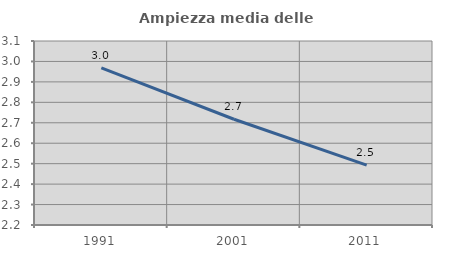
| Category | Ampiezza media delle famiglie |
|---|---|
| 1991.0 | 2.969 |
| 2001.0 | 2.717 |
| 2011.0 | 2.493 |